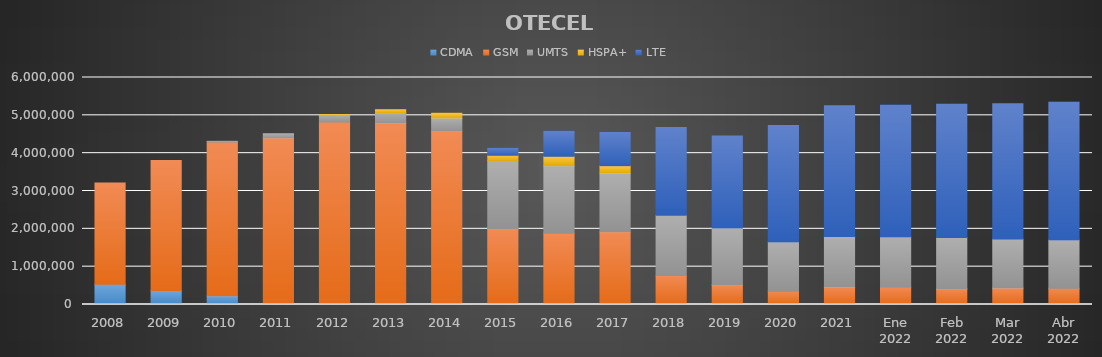
| Category | CDMA | GSM | UMTS | HSPA+ | LTE |
|---|---|---|---|---|---|
| 2008 | 533206 | 2678716 | 0 | 0 | 0 |
| 2009 | 370711 | 3435721 | 0 | 0 | 0 |
| 2010 | 232396 | 4061909 | 20294 | 0 | 0 |
| 2011 | 0 | 4403305 | 110569 | 0 | 0 |
| 2012 | 0 | 4823675 | 174375 | 21636 | 0 |
| 2013 | 0 | 4797632 | 272871 | 77805 | 0 |
| 2014 | 0 | 4589205 | 341647 | 124793 | 0 |
| 2015 | 0 | 2002436 | 1805322 | 136952 | 189988 |
| 2016 | 0 | 1881781 | 1787014 | 248541 | 662756 |
| 2017 | 0 | 1924184.634 | 1552693.066 | 187515.199 | 884631.101 |
| 2018 | 0 | 765658.891 | 1596404.415 | 0 | 2317582.694 |
| 2019 | 0 | 525011.505 | 1498097.705 | 0 | 2433246.79 |
| 2020 | 0 | 348601.621 | 1305745.099 | 0 | 3075378.28 |
| 2021 | 0 | 463116 | 1335075 | 0 | 3456277 |
| Ene 2022 | 0 | 461271.915 | 1324789.367 | 0 | 3486728.718 |
| Feb 2022 | 0 | 419568.449 | 1353562.987 | 0 | 3524816.564 |
| Mar 2022 | 0 | 438224.686 | 1291201.748 | 0 | 3579803.566 |
| Abr 2022 | 0 | 431954.615 | 1274369.387 | 0 | 3643464.999 |